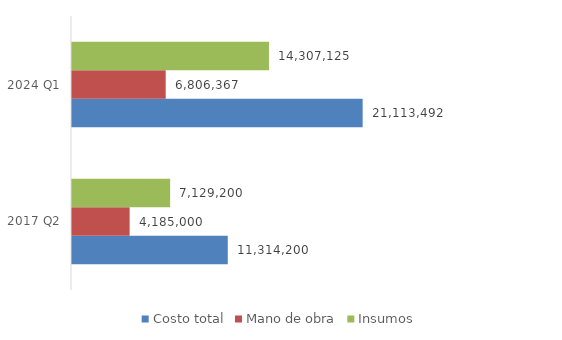
| Category | Costo total | Mano de obra | Insumos |
|---|---|---|---|
| 2017 Q2 | 11314200 | 4185000 | 7129200 |
| 2024 Q1 | 21113492.008 | 6806367 | 14307125.008 |